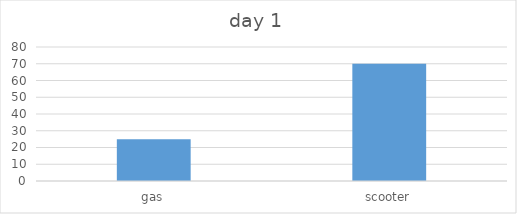
| Category | day 1 |
|---|---|
| gas | 25 |
| scooter | 70 |